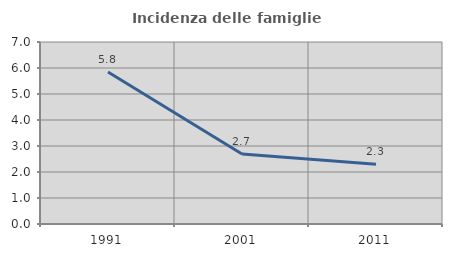
| Category | Incidenza delle famiglie numerose |
|---|---|
| 1991.0 | 5.848 |
| 2001.0 | 2.695 |
| 2011.0 | 2.295 |